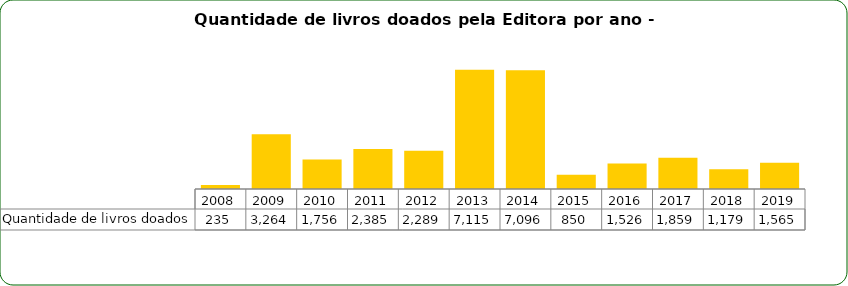
| Category | Quantidade de livros doados |
|---|---|
| 2008.0 | 235 |
| 2009.0 | 3264 |
| 2010.0 | 1756 |
| 2011.0 | 2385 |
| 2012.0 | 2289 |
| 2013.0 | 7115 |
| 2014.0 | 7096 |
| 2015.0 | 850 |
| 2016.0 | 1526 |
| 2017.0 | 1859 |
| 2018.0 | 1179 |
| 2019.0 | 1565 |